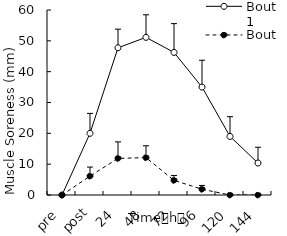
| Category | Bout 1 | Bout 2 |
|---|---|---|
| pre | 0 | 0 |
| post | 20 | 6.125 |
| 24 | 47.75 | 11.875 |
| 48 | 51.125 | 12.125 |
| 72 | 46.25 | 4.75 |
| 96 | 35 | 1.875 |
| 120 | 19 | 0 |
| 144 | 10.375 | 0 |